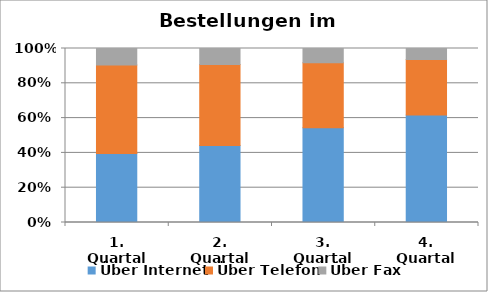
| Category | Über Internet | Über Telefon | Über Fax |
|---|---|---|---|
| 1. Quartal | 4100 | 5241 | 985 |
| 2. Quartal | 4723 | 4965 | 975 |
| 3. Quartal | 6153 | 4236 | 924 |
| 4. Quartal | 7689 | 3965 | 785 |